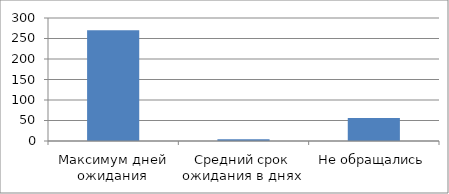
| Category | Series 0 |
|---|---|
| Максимум дней ожидания | 270 |
| Средний срок ожидания в днях | 4.485 |
| Не обращались | 56 |